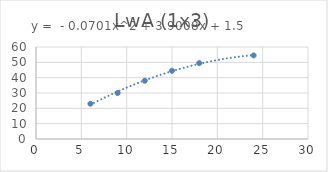
| Category | Series 0 |
|---|---|
| 6.0 | 23 |
| 9.0 | 30 |
| 12.0 | 38 |
| 15.0 | 44.5 |
| 18.0 | 49.5 |
| 24.0 | 54.5 |